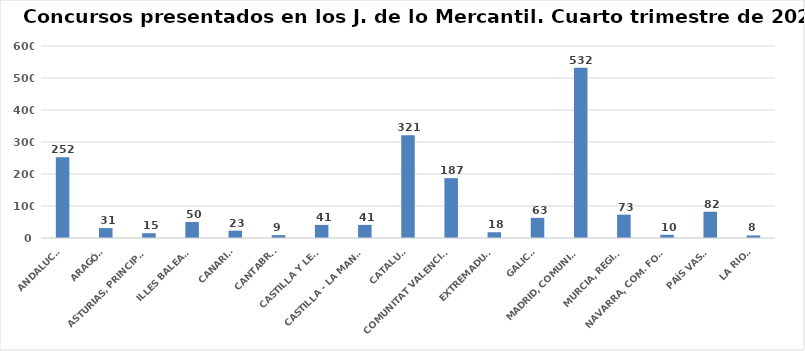
| Category | Series 0 |
|---|---|
| ANDALUCÍA | 252 |
| ARAGÓN | 31 |
| ASTURIAS, PRINCIPADO | 15 |
| ILLES BALEARS | 50 |
| CANARIAS | 23 |
| CANTABRIA | 9 |
| CASTILLA Y LEÓN | 41 |
| CASTILLA - LA MANCHA | 41 |
| CATALUÑA | 321 |
| COMUNITAT VALENCIANA | 187 |
| EXTREMADURA | 18 |
| GALICIA | 63 |
| MADRID, COMUNIDAD | 532 |
| MURCIA, REGIÓN | 73 |
| NAVARRA, COM. FORAL | 10 |
| PAÍS VASCO | 82 |
| LA RIOJA | 8 |